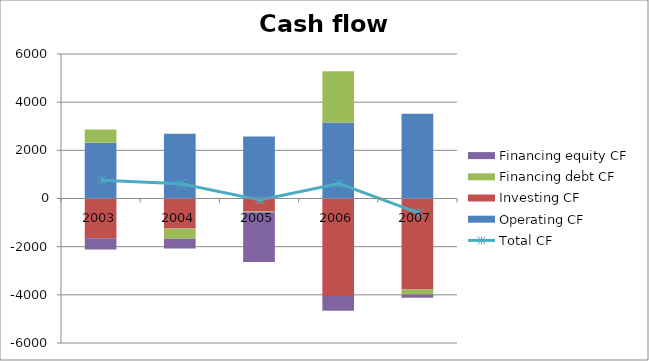
| Category | Operating CF | Investing CF | Financing debt CF | Financing equity CF |
|---|---|---|---|---|
| 2003.0 | 2312 | -1653 | 558 | -461 |
| 2004.0 | 2690 | -1242 | -432 | -407 |
| 2005.0 | 2579 | -541 | -27 | -2070 |
| 2006.0 | 3151 | -4051 | 2128 | -609 |
| 2007.0 | 3519 | -3774 | -212 | -132 |